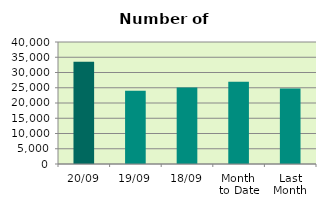
| Category | Series 0 |
|---|---|
| 20/09 | 33486 |
| 19/09 | 24006 |
| 18/09 | 25116 |
| Month 
to Date | 26966.571 |
| Last
Month | 24784.957 |